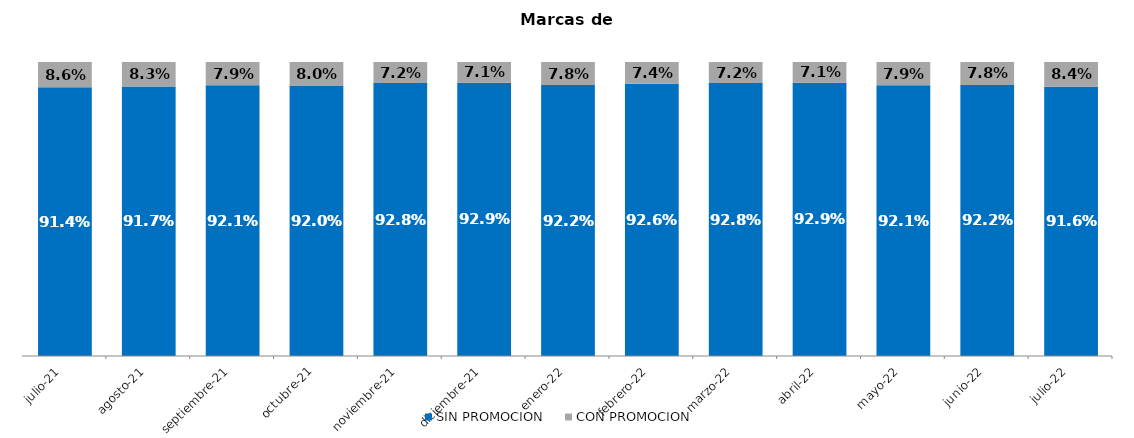
| Category | SIN PROMOCION   | CON PROMOCION   |
|---|---|---|
| 2021-07-01 | 0.914 | 0.086 |
| 2021-08-01 | 0.917 | 0.083 |
| 2021-09-01 | 0.921 | 0.079 |
| 2021-10-01 | 0.92 | 0.08 |
| 2021-11-01 | 0.928 | 0.072 |
| 2021-12-01 | 0.929 | 0.071 |
| 2022-01-01 | 0.922 | 0.078 |
| 2022-02-01 | 0.926 | 0.074 |
| 2022-03-01 | 0.928 | 0.072 |
| 2022-04-01 | 0.929 | 0.071 |
| 2022-05-01 | 0.921 | 0.079 |
| 2022-06-01 | 0.922 | 0.078 |
| 2022-07-01 | 0.916 | 0.084 |